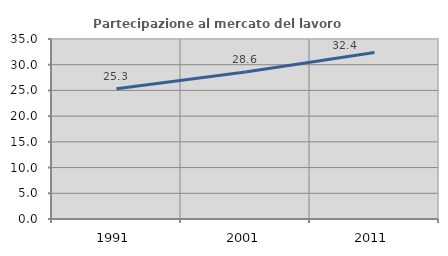
| Category | Partecipazione al mercato del lavoro  femminile |
|---|---|
| 1991.0 | 25.329 |
| 2001.0 | 28.571 |
| 2011.0 | 32.374 |